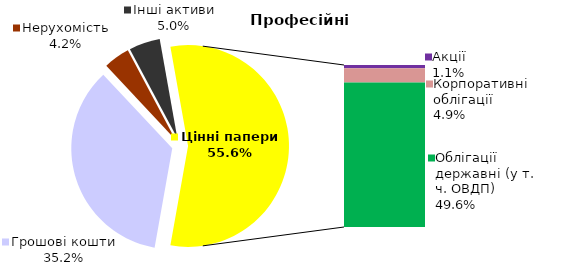
| Category | Професійні |
|---|---|
| Грошові кошти | 58.891 |
| Банківські метали | 0 |
| Нерухомість | 7.006 |
| Інші активи | 8.347 |
| Акції | 1.901 |
| Корпоративні облігації | 8.193 |
| Облігації місцевих рад | 0 |
| Облігації державні (у т. ч. ОВДП) | 82.892 |